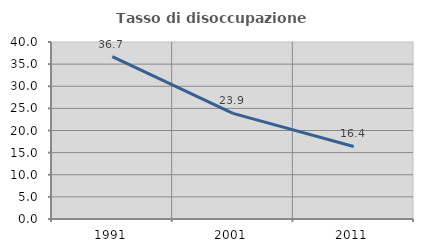
| Category | Tasso di disoccupazione giovanile  |
|---|---|
| 1991.0 | 36.677 |
| 2001.0 | 23.874 |
| 2011.0 | 16.393 |